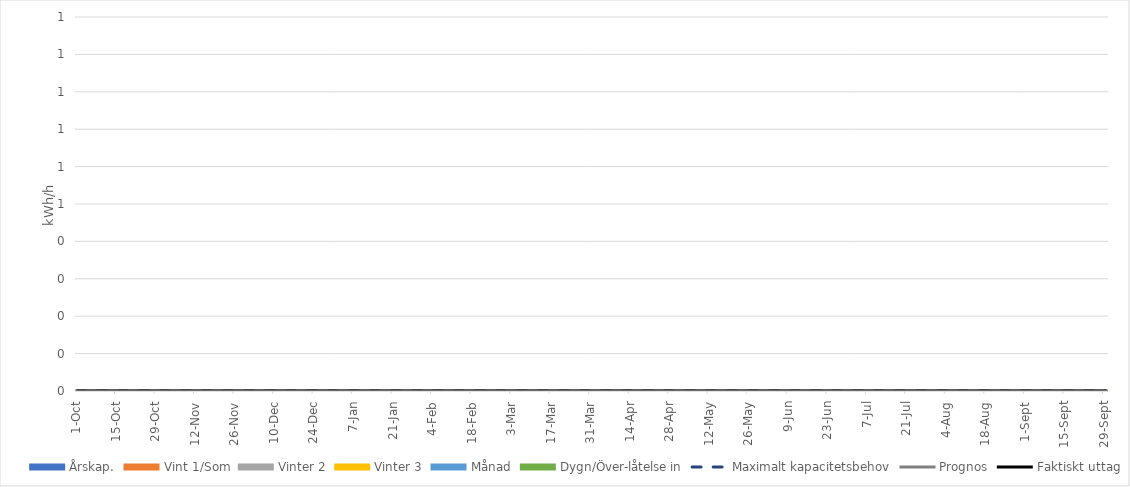
| Category | Maximalt kapacitetsbehov | Prognos | Faktiskt uttag |
|---|---|---|---|
| 0 | 0 | 0 | 0 |
| 1900-01-01 | 0 | 0 | 0 |
| 1900-01-02 | 0 | 0 | 0 |
| 1900-01-03 | 0 | 0 | 0 |
| 1900-01-04 | 0 | 0 | 0 |
| 1900-01-05 | 0 | 0 | 0 |
| 1900-01-06 | 0 | 0 | 0 |
| 1900-01-07 | 0 | 0 | 0 |
| 1900-01-08 | 0 | 0 | 0 |
| 1900-01-09 | 0 | 0 | 0 |
| 1900-01-10 | 0 | 0 | 0 |
| 1900-01-11 | 0 | 0 | 0 |
| 1900-01-12 | 0 | 0 | 0 |
| 1900-01-13 | 0 | 0 | 0 |
| 1900-01-14 | 0 | 0 | 0 |
| 1900-01-15 | 0 | 0 | 0 |
| 1900-01-16 | 0 | 0 | 0 |
| 1900-01-17 | 0 | 0 | 0 |
| 1900-01-18 | 0 | 0 | 0 |
| 1900-01-19 | 0 | 0 | 0 |
| 1900-01-20 | 0 | 0 | 0 |
| 1900-01-21 | 0 | 0 | 0 |
| 1900-01-22 | 0 | 0 | 0 |
| 1900-01-23 | 0 | 0 | 0 |
| 1900-01-24 | 0 | 0 | 0 |
| 1900-01-25 | 0 | 0 | 0 |
| 1900-01-26 | 0 | 0 | 0 |
| 1900-01-27 | 0 | 0 | 0 |
| 1900-01-28 | 0 | 0 | 0 |
| 1900-01-29 | 0 | 0 | 0 |
| 1900-01-30 | 0 | 0 | 0 |
| 1900-01-31 | 0 | 0 | 0 |
| 1900-02-01 | 0 | 0 | 0 |
| 1900-02-02 | 0 | 0 | 0 |
| 1900-02-03 | 0 | 0 | 0 |
| 1900-02-04 | 0 | 0 | 0 |
| 1900-02-05 | 0 | 0 | 0 |
| 1900-02-06 | 0 | 0 | 0 |
| 1900-02-07 | 0 | 0 | 0 |
| 1900-02-08 | 0 | 0 | 0 |
| 1900-02-09 | 0 | 0 | 0 |
| 1900-02-10 | 0 | 0 | 0 |
| 1900-02-11 | 0 | 0 | 0 |
| 1900-02-12 | 0 | 0 | 0 |
| 1900-02-13 | 0 | 0 | 0 |
| 1900-02-14 | 0 | 0 | 0 |
| 1900-02-15 | 0 | 0 | 0 |
| 1900-02-16 | 0 | 0 | 0 |
| 1900-02-17 | 0 | 0 | 0 |
| 1900-02-18 | 0 | 0 | 0 |
| 1900-02-19 | 0 | 0 | 0 |
| 1900-02-20 | 0 | 0 | 0 |
| 1900-02-21 | 0 | 0 | 0 |
| 1900-02-22 | 0 | 0 | 0 |
| 1900-02-23 | 0 | 0 | 0 |
| 1900-02-24 | 0 | 0 | 0 |
| 1900-02-25 | 0 | 0 | 0 |
| 1900-02-26 | 0 | 0 | 0 |
| 1900-02-27 | 0 | 0 | 0 |
| 1900-02-28 | 0 | 0 | 0 |
| 1900-02-28 | 0 | 0 | 0 |
| 1900-03-01 | 0 | 0 | 0 |
| 1900-03-02 | 0 | 0 | 0 |
| 1900-03-03 | 0 | 0 | 0 |
| 1900-03-04 | 0 | 0 | 0 |
| 1900-03-05 | 0 | 0 | 0 |
| 1900-03-06 | 0 | 0 | 0 |
| 1900-03-07 | 0 | 0 | 0 |
| 1900-03-08 | 0 | 0 | 0 |
| 1900-03-09 | 0 | 0 | 0 |
| 1900-03-10 | 0 | 0 | 0 |
| 1900-03-11 | 0 | 0 | 0 |
| 1900-03-12 | 0 | 0 | 0 |
| 1900-03-13 | 0 | 0 | 0 |
| 1900-03-14 | 0 | 0 | 0 |
| 1900-03-15 | 0 | 0 | 0 |
| 1900-03-16 | 0 | 0 | 0 |
| 1900-03-17 | 0 | 0 | 0 |
| 1900-03-18 | 0 | 0 | 0 |
| 1900-03-19 | 0 | 0 | 0 |
| 1900-03-20 | 0 | 0 | 0 |
| 1900-03-21 | 0 | 0 | 0 |
| 1900-03-22 | 0 | 0 | 0 |
| 1900-03-23 | 0 | 0 | 0 |
| 1900-03-24 | 0 | 0 | 0 |
| 1900-03-25 | 0 | 0 | 0 |
| 1900-03-26 | 0 | 0 | 0 |
| 1900-03-27 | 0 | 0 | 0 |
| 1900-03-28 | 0 | 0 | 0 |
| 1900-03-29 | 0 | 0 | 0 |
| 1900-03-30 | 0 | 0 | 0 |
| 1900-03-31 | 0 | 0 | 0 |
| 1900-04-01 | 0 | 0 | 0 |
| 1900-04-02 | 0 | 0 | 0 |
| 1900-04-03 | 0 | 0 | 0 |
| 1900-04-04 | 0 | 0 | 0 |
| 1900-04-05 | 0 | 0 | 0 |
| 1900-04-06 | 0 | 0 | 0 |
| 1900-04-07 | 0 | 0 | 0 |
| 1900-04-08 | 0 | 0 | 0 |
| 1900-04-09 | 0 | 0 | 0 |
| 1900-04-10 | 0 | 0 | 0 |
| 1900-04-11 | 0 | 0 | 0 |
| 1900-04-12 | 0 | 0 | 0 |
| 1900-04-13 | 0 | 0 | 0 |
| 1900-04-14 | 0 | 0 | 0 |
| 1900-04-15 | 0 | 0 | 0 |
| 1900-04-16 | 0 | 0 | 0 |
| 1900-04-17 | 0 | 0 | 0 |
| 1900-04-18 | 0 | 0 | 0 |
| 1900-04-19 | 0 | 0 | 0 |
| 1900-04-20 | 0 | 0 | 0 |
| 1900-04-21 | 0 | 0 | 0 |
| 1900-04-22 | 0 | 0 | 0 |
| 1900-04-23 | 0 | 0 | 0 |
| 1900-04-24 | 0 | 0 | 0 |
| 1900-04-25 | 0 | 0 | 0 |
| 1900-04-26 | 0 | 0 | 0 |
| 1900-04-27 | 0 | 0 | 0 |
| 1900-04-28 | 0 | 0 | 0 |
| 1900-04-29 | 0 | 0 | 0 |
| 1900-04-30 | 0 | 0 | 0 |
| 1900-05-01 | 0 | 0 | 0 |
| 1900-05-02 | 0 | 0 | 0 |
| 1900-05-03 | 0 | 0 | 0 |
| 1900-05-04 | 0 | 0 | 0 |
| 1900-05-05 | 0 | 0 | 0 |
| 1900-05-06 | 0 | 0 | 0 |
| 1900-05-07 | 0 | 0 | 0 |
| 1900-05-08 | 0 | 0 | 0 |
| 1900-05-09 | 0 | 0 | 0 |
| 1900-05-10 | 0 | 0 | 0 |
| 1900-05-11 | 0 | 0 | 0 |
| 1900-05-12 | 0 | 0 | 0 |
| 1900-05-13 | 0 | 0 | 0 |
| 1900-05-14 | 0 | 0 | 0 |
| 1900-05-15 | 0 | 0 | 0 |
| 1900-05-16 | 0 | 0 | 0 |
| 1900-05-17 | 0 | 0 | 0 |
| 1900-05-18 | 0 | 0 | 0 |
| 1900-05-19 | 0 | 0 | 0 |
| 1900-05-20 | 0 | 0 | 0 |
| 1900-05-21 | 0 | 0 | 0 |
| 1900-05-22 | 0 | 0 | 0 |
| 1900-05-23 | 0 | 0 | 0 |
| 1900-05-24 | 0 | 0 | 0 |
| 1900-05-25 | 0 | 0 | 0 |
| 1900-05-26 | 0 | 0 | 0 |
| 1900-05-27 | 0 | 0 | 0 |
| 1900-05-28 | 0 | 0 | 0 |
| 1900-05-29 | 0 | 0 | 0 |
| 1900-05-30 | 0 | 0 | 0 |
| 1900-05-31 | 0 | 0 | 0 |
| 1900-06-01 | 0 | 0 | 0 |
| 1900-06-02 | 0 | 0 | 0 |
| 1900-06-03 | 0 | 0 | 0 |
| 1900-06-04 | 0 | 0 | 0 |
| 1900-06-05 | 0 | 0 | 0 |
| 1900-06-06 | 0 | 0 | 0 |
| 1900-06-07 | 0 | 0 | 0 |
| 1900-06-08 | 0 | 0 | 0 |
| 1900-06-09 | 0 | 0 | 0 |
| 1900-06-10 | 0 | 0 | 0 |
| 1900-06-11 | 0 | 0 | 0 |
| 1900-06-12 | 0 | 0 | 0 |
| 1900-06-13 | 0 | 0 | 0 |
| 1900-06-14 | 0 | 0 | 0 |
| 1900-06-15 | 0 | 0 | 0 |
| 1900-06-16 | 0 | 0 | 0 |
| 1900-06-17 | 0 | 0 | 0 |
| 1900-06-18 | 0 | 0 | 0 |
| 1900-06-19 | 0 | 0 | 0 |
| 1900-06-20 | 0 | 0 | 0 |
| 1900-06-21 | 0 | 0 | 0 |
| 1900-06-22 | 0 | 0 | 0 |
| 1900-06-23 | 0 | 0 | 0 |
| 1900-06-24 | 0 | 0 | 0 |
| 1900-06-25 | 0 | 0 | 0 |
| 1900-06-26 | 0 | 0 | 0 |
| 1900-06-27 | 0 | 0 | 0 |
| 1900-06-28 | 0 | 0 | 0 |
| 1900-06-29 | 0 | 0 | 0 |
| 1900-06-30 | 0 | 0 | 0 |
| 1900-07-01 | 0 | 0 | 0 |
| 1900-07-02 | 0 | 0 | 0 |
| 1900-07-03 | 0 | 0 | 0 |
| 1900-07-04 | 0 | 0 | 0 |
| 1900-07-05 | 0 | 0 | 0 |
| 1900-07-06 | 0 | 0 | 0 |
| 1900-07-07 | 0 | 0 | 0 |
| 1900-07-08 | 0 | 0 | 0 |
| 1900-07-09 | 0 | 0 | 0 |
| 1900-07-10 | 0 | 0 | 0 |
| 1900-07-11 | 0 | 0 | 0 |
| 1900-07-12 | 0 | 0 | 0 |
| 1900-07-13 | 0 | 0 | 0 |
| 1900-07-14 | 0 | 0 | 0 |
| 1900-07-15 | 0 | 0 | 0 |
| 1900-07-16 | 0 | 0 | 0 |
| 1900-07-17 | 0 | 0 | 0 |
| 1900-07-18 | 0 | 0 | 0 |
| 1900-07-19 | 0 | 0 | 0 |
| 1900-07-20 | 0 | 0 | 0 |
| 1900-07-21 | 0 | 0 | 0 |
| 1900-07-22 | 0 | 0 | 0 |
| 1900-07-23 | 0 | 0 | 0 |
| 1900-07-24 | 0 | 0 | 0 |
| 1900-07-25 | 0 | 0 | 0 |
| 1900-07-26 | 0 | 0 | 0 |
| 1900-07-27 | 0 | 0 | 0 |
| 1900-07-28 | 0 | 0 | 0 |
| 1900-07-29 | 0 | 0 | 0 |
| 1900-07-30 | 0 | 0 | 0 |
| 1900-07-31 | 0 | 0 | 0 |
| 1900-08-01 | 0 | 0 | 0 |
| 1900-08-02 | 0 | 0 | 0 |
| 1900-08-03 | 0 | 0 | 0 |
| 1900-08-04 | 0 | 0 | 0 |
| 1900-08-05 | 0 | 0 | 0 |
| 1900-08-06 | 0 | 0 | 0 |
| 1900-08-07 | 0 | 0 | 0 |
| 1900-08-08 | 0 | 0 | 0 |
| 1900-08-09 | 0 | 0 | 0 |
| 1900-08-10 | 0 | 0 | 0 |
| 1900-08-11 | 0 | 0 | 0 |
| 1900-08-12 | 0 | 0 | 0 |
| 1900-08-13 | 0 | 0 | 0 |
| 1900-08-14 | 0 | 0 | 0 |
| 1900-08-15 | 0 | 0 | 0 |
| 1900-08-16 | 0 | 0 | 0 |
| 1900-08-17 | 0 | 0 | 0 |
| 1900-08-18 | 0 | 0 | 0 |
| 1900-08-19 | 0 | 0 | 0 |
| 1900-08-20 | 0 | 0 | 0 |
| 1900-08-21 | 0 | 0 | 0 |
| 1900-08-22 | 0 | 0 | 0 |
| 1900-08-23 | 0 | 0 | 0 |
| 1900-08-24 | 0 | 0 | 0 |
| 1900-08-25 | 0 | 0 | 0 |
| 1900-08-26 | 0 | 0 | 0 |
| 1900-08-27 | 0 | 0 | 0 |
| 1900-08-28 | 0 | 0 | 0 |
| 1900-08-29 | 0 | 0 | 0 |
| 1900-08-30 | 0 | 0 | 0 |
| 1900-08-31 | 0 | 0 | 0 |
| 1900-09-01 | 0 | 0 | 0 |
| 1900-09-02 | 0 | 0 | 0 |
| 1900-09-03 | 0 | 0 | 0 |
| 1900-09-04 | 0 | 0 | 0 |
| 1900-09-05 | 0 | 0 | 0 |
| 1900-09-06 | 0 | 0 | 0 |
| 1900-09-07 | 0 | 0 | 0 |
| 1900-09-08 | 0 | 0 | 0 |
| 1900-09-09 | 0 | 0 | 0 |
| 1900-09-10 | 0 | 0 | 0 |
| 1900-09-11 | 0 | 0 | 0 |
| 1900-09-12 | 0 | 0 | 0 |
| 1900-09-13 | 0 | 0 | 0 |
| 1900-09-14 | 0 | 0 | 0 |
| 1900-09-15 | 0 | 0 | 0 |
| 1900-09-16 | 0 | 0 | 0 |
| 1900-09-17 | 0 | 0 | 0 |
| 1900-09-18 | 0 | 0 | 0 |
| 1900-09-19 | 0 | 0 | 0 |
| 1900-09-20 | 0 | 0 | 0 |
| 1900-09-21 | 0 | 0 | 0 |
| 1900-09-22 | 0 | 0 | 0 |
| 1900-09-23 | 0 | 0 | 0 |
| 1900-09-24 | 0 | 0 | 0 |
| 1900-09-25 | 0 | 0 | 0 |
| 1900-09-26 | 0 | 0 | 0 |
| 1900-09-27 | 0 | 0 | 0 |
| 1900-09-28 | 0 | 0 | 0 |
| 1900-09-29 | 0 | 0 | 0 |
| 1900-09-30 | 0 | 0 | 0 |
| 1900-10-01 | 0 | 0 | 0 |
| 1900-10-02 | 0 | 0 | 0 |
| 1900-10-03 | 0 | 0 | 0 |
| 1900-10-04 | 0 | 0 | 0 |
| 1900-10-05 | 0 | 0 | 0 |
| 1900-10-06 | 0 | 0 | 0 |
| 1900-10-07 | 0 | 0 | 0 |
| 1900-10-08 | 0 | 0 | 0 |
| 1900-10-09 | 0 | 0 | 0 |
| 1900-10-10 | 0 | 0 | 0 |
| 1900-10-11 | 0 | 0 | 0 |
| 1900-10-12 | 0 | 0 | 0 |
| 1900-10-13 | 0 | 0 | 0 |
| 1900-10-14 | 0 | 0 | 0 |
| 1900-10-15 | 0 | 0 | 0 |
| 1900-10-16 | 0 | 0 | 0 |
| 1900-10-17 | 0 | 0 | 0 |
| 1900-10-18 | 0 | 0 | 0 |
| 1900-10-19 | 0 | 0 | 0 |
| 1900-10-20 | 0 | 0 | 0 |
| 1900-10-21 | 0 | 0 | 0 |
| 1900-10-22 | 0 | 0 | 0 |
| 1900-10-23 | 0 | 0 | 0 |
| 1900-10-24 | 0 | 0 | 0 |
| 1900-10-25 | 0 | 0 | 0 |
| 1900-10-26 | 0 | 0 | 0 |
| 1900-10-27 | 0 | 0 | 0 |
| 1900-10-28 | 0 | 0 | 0 |
| 1900-10-29 | 0 | 0 | 0 |
| 1900-10-30 | 0 | 0 | 0 |
| 1900-10-31 | 0 | 0 | 0 |
| 1900-11-01 | 0 | 0 | 0 |
| 1900-11-02 | 0 | 0 | 0 |
| 1900-11-03 | 0 | 0 | 0 |
| 1900-11-04 | 0 | 0 | 0 |
| 1900-11-05 | 0 | 0 | 0 |
| 1900-11-06 | 0 | 0 | 0 |
| 1900-11-07 | 0 | 0 | 0 |
| 1900-11-08 | 0 | 0 | 0 |
| 1900-11-09 | 0 | 0 | 0 |
| 1900-11-10 | 0 | 0 | 0 |
| 1900-11-11 | 0 | 0 | 0 |
| 1900-11-12 | 0 | 0 | 0 |
| 1900-11-13 | 0 | 0 | 0 |
| 1900-11-14 | 0 | 0 | 0 |
| 1900-11-15 | 0 | 0 | 0 |
| 1900-11-16 | 0 | 0 | 0 |
| 1900-11-17 | 0 | 0 | 0 |
| 1900-11-18 | 0 | 0 | 0 |
| 1900-11-19 | 0 | 0 | 0 |
| 1900-11-20 | 0 | 0 | 0 |
| 1900-11-21 | 0 | 0 | 0 |
| 1900-11-22 | 0 | 0 | 0 |
| 1900-11-23 | 0 | 0 | 0 |
| 1900-11-24 | 0 | 0 | 0 |
| 1900-11-25 | 0 | 0 | 0 |
| 1900-11-26 | 0 | 0 | 0 |
| 1900-11-27 | 0 | 0 | 0 |
| 1900-11-28 | 0 | 0 | 0 |
| 1900-11-29 | 0 | 0 | 0 |
| 1900-11-30 | 0 | 0 | 0 |
| 1900-12-01 | 0 | 0 | 0 |
| 1900-12-02 | 0 | 0 | 0 |
| 1900-12-03 | 0 | 0 | 0 |
| 1900-12-04 | 0 | 0 | 0 |
| 1900-12-05 | 0 | 0 | 0 |
| 1900-12-06 | 0 | 0 | 0 |
| 1900-12-07 | 0 | 0 | 0 |
| 1900-12-08 | 0 | 0 | 0 |
| 1900-12-09 | 0 | 0 | 0 |
| 1900-12-10 | 0 | 0 | 0 |
| 1900-12-11 | 0 | 0 | 0 |
| 1900-12-12 | 0 | 0 | 0 |
| 1900-12-13 | 0 | 0 | 0 |
| 1900-12-14 | 0 | 0 | 0 |
| 1900-12-15 | 0 | 0 | 0 |
| 1900-12-16 | 0 | 0 | 0 |
| 1900-12-17 | 0 | 0 | 0 |
| 1900-12-18 | 0 | 0 | 0 |
| 1900-12-19 | 0 | 0 | 0 |
| 1900-12-20 | 0 | 0 | 0 |
| 1900-12-21 | 0 | 0 | 0 |
| 1900-12-22 | 0 | 0 | 0 |
| 1900-12-23 | 0 | 0 | 0 |
| 1900-12-24 | 0 | 0 | 0 |
| 1900-12-25 | 0 | 0 | 0 |
| 1900-12-26 | 0 | 0 | 0 |
| 1900-12-27 | 0 | 0 | 0 |
| 1900-12-28 | 0 | 0 | 0 |
| 1900-12-29 | 0 | 0 | 0 |
| 1900-12-30 | 0 | 0 | 0 |